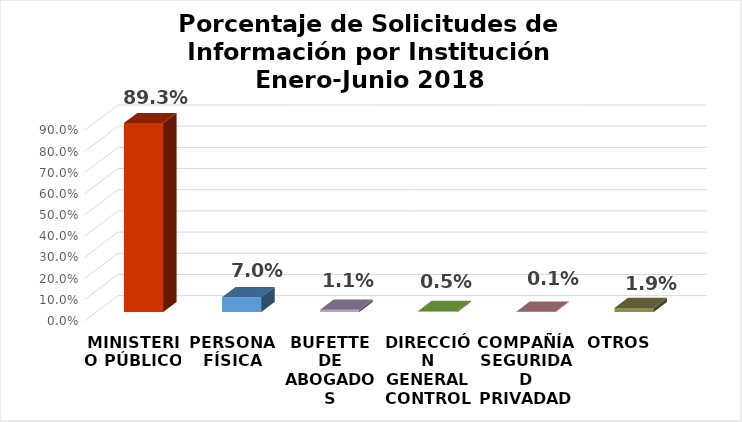
| Category | Series 0 |
|---|---|
| MINISTERIO PÚBLICO | 0.893 |
| PERSONA FÍSICA | 0.07 |
| BUFETTE DE ABOGADOS | 0.011 |
| DIRECCIÓN GENERAL CONTROL DE DROGAS | 0.005 |
| COMPAÑÍA SEGURIDAD PRIVADAD | 0.001 |
| OTROS  | 0.019 |